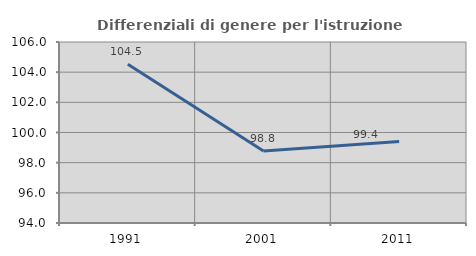
| Category | Differenziali di genere per l'istruzione superiore |
|---|---|
| 1991.0 | 104.529 |
| 2001.0 | 98.777 |
| 2011.0 | 99.408 |